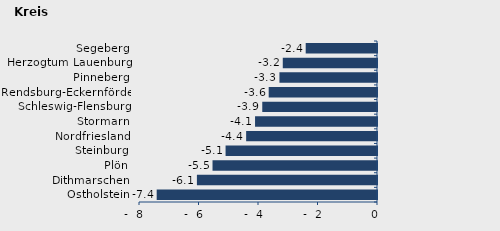
| Category | Überschuss der Geborenen (+) bzw. Gestorbenen (-) |
|---|---|
| Ostholstein | -7.405 |
| Dithmarschen | -6.054 |
| Plön | -5.529 |
| Steinburg | -5.09 |
| Nordfriesland | -4.398 |
| Stormarn | -4.099 |
| Schleswig-Flensburg | -3.857 |
| Rendsburg-Eckernförde | -3.641 |
| Pinneberg | -3.28 |
| Herzogtum Lauenburg | -3.167 |
| Segeberg | -2.397 |